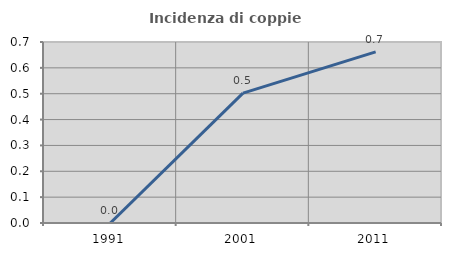
| Category | Incidenza di coppie miste |
|---|---|
| 1991.0 | 0 |
| 2001.0 | 0.503 |
| 2011.0 | 0.662 |